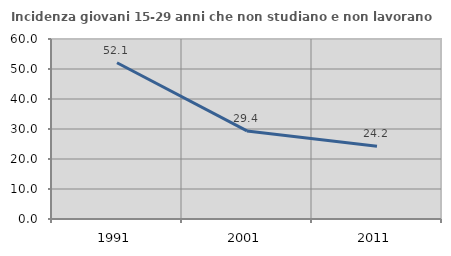
| Category | Incidenza giovani 15-29 anni che non studiano e non lavorano  |
|---|---|
| 1991.0 | 52.078 |
| 2001.0 | 29.368 |
| 2011.0 | 24.215 |